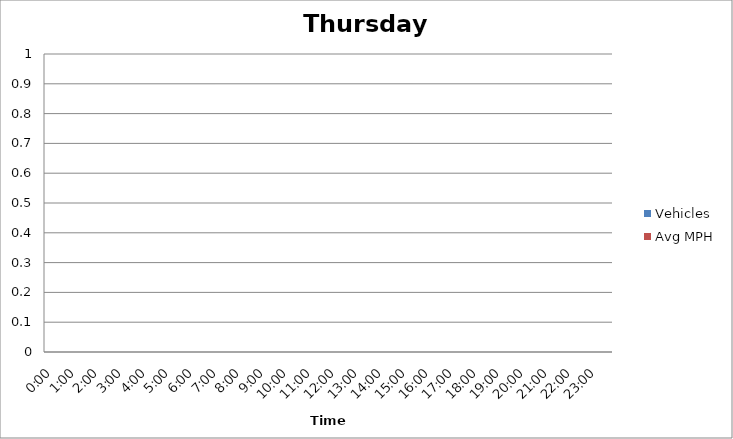
| Category | Vehicles | Avg MPH |
|---|---|---|
| 0:00 | 0 | 0 |
| 1:00 | 0 | 0 |
| 2:00 | 0 | 0 |
| 3:00 | 0 | 0 |
| 4:00 | 0 | 0 |
| 5:00 | 0 | 0 |
| 6:00 | 0 | 0 |
| 7:00 | 0 | 0 |
| 8:00 | 0 | 0 |
| 9:00 | 0 | 0 |
| 10:00 | 0 | 0 |
| 11:00 | 0 | 0 |
| 12:00 | 0 | 0 |
| 13:00 | 0 | 0 |
| 14:00 | 0 | 0 |
| 15:00 | 0 | 0 |
| 16:00 | 0 | 0 |
| 17:00 | 0 | 0 |
| 18:00 | 0 | 0 |
| 19:00 | 0 | 0 |
| 20:00 | 0 | 0 |
| 21:00 | 0 | 0 |
| 22:00 | 0 | 0 |
| 23:00 | 0 | 0 |